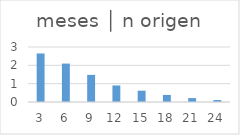
| Category | meses │ n origen |
|---|---|
| 3.0 | 2.647 |
| 6.0 | 2.095 |
| 9.0 | 1.48 |
| 12.0 | 0.901 |
| 15.0 | 0.615 |
| 18.0 | 0.386 |
| 21.0 | 0.213 |
| 24.0 | 0.106 |